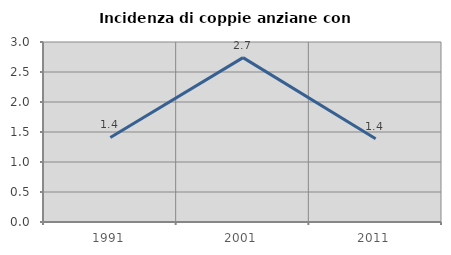
| Category | Incidenza di coppie anziane con figli |
|---|---|
| 1991.0 | 1.408 |
| 2001.0 | 2.74 |
| 2011.0 | 1.389 |